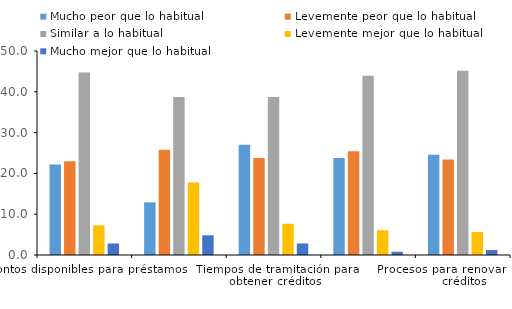
| Category | Mucho peor que lo habitual | Levemente peor que lo habitual | Similar a lo habitual | Levemente mejor que lo habitual | Mucho mejor que lo habitual |
|---|---|---|---|---|---|
| Montos disponibles para préstamos | 22.177 | 22.984 | 44.758 | 7.258 | 2.823 |
| Tasas de interés | 12.903 | 25.806 | 38.71 | 17.742 | 4.839 |
| Tiempos de tramitación para obtener créditos | 27.016 | 23.79 | 38.71 | 7.661 | 2.823 |
| Criterios para valorizar garantías | 23.79 | 25.403 | 43.952 | 6.048 | 0.806 |
| Procesos para renovar líneas de créditos | 24.597 | 23.387 | 45.161 | 5.645 | 1.21 |